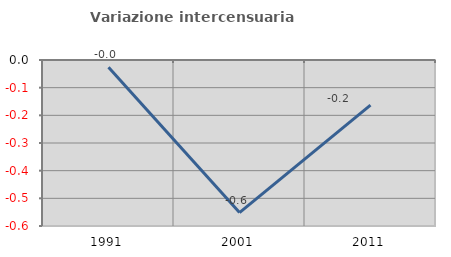
| Category | Variazione intercensuaria annua |
|---|---|
| 1991.0 | -0.026 |
| 2001.0 | -0.552 |
| 2011.0 | -0.163 |